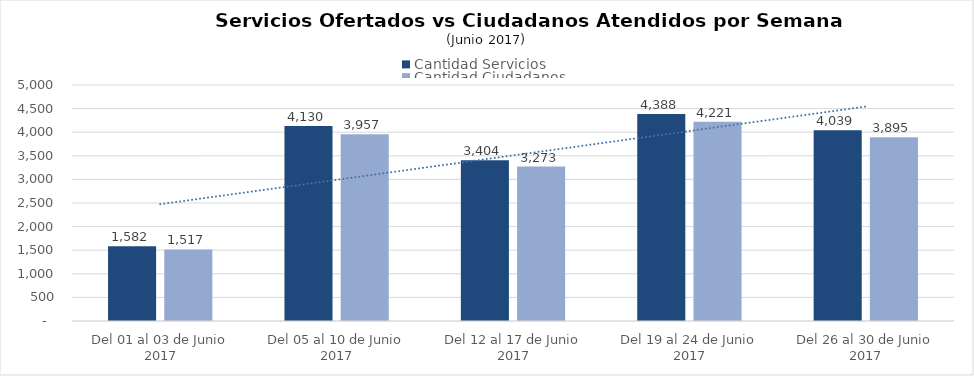
| Category | Cantidad Servicios | Cantidad Ciudadanos |
|---|---|---|
| Del 01 al 03 de Junio 2017 | 1582 | 1517 |
| Del 05 al 10 de Junio 2017 | 4130 | 3957 |
| Del 12 al 17 de Junio 2017 | 3404 | 3273 |
| Del 19 al 24 de Junio 2017 | 4388 | 4221 |
| Del 26 al 30 de Junio 2017 | 4039 | 3895 |